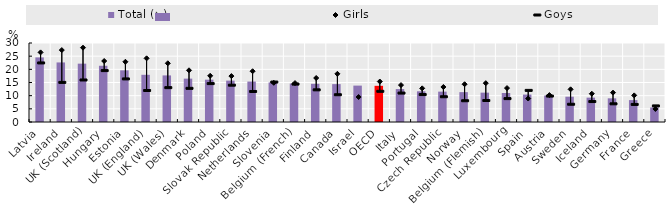
| Category | Total (↘) |
|---|---|
| Latvia | 24.529 |
| Ireland | 22.621 |
| UK (Scotland) | 22.158 |
| Hungary | 21.356 |
| Estonia | 19.623 |
| UK (England) | 17.925 |
| UK (Wales) | 17.693 |
| Denmark | 16.468 |
| Poland | 16.075 |
| Slovak Republic | 15.715 |
| Netherlands | 15.356 |
| Slovenia | 15.022 |
| Belgium (French) | 14.594 |
| Finland | 14.503 |
| Canada | 14.387 |
| Israel | 13.821 |
| OECD | 13.738 |
| Italy | 12.503 |
| Portugal | 11.662 |
| Czech Republic | 11.532 |
| Norway | 11.342 |
| Belgium (Flemish) | 11.151 |
| Luxembourg | 11.024 |
| Spain | 10.42 |
| Austria | 10.045 |
| Sweden | 9.609 |
| Iceland | 9.254 |
| Germany | 8.992 |
| France | 8.317 |
| Greece | 5.524 |